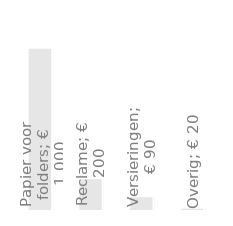
| Category | Jaaruitgaven |
|---|---|
| Papier voor folders | 1000 |
| Reclame | 200 |
| Versieringen | 90 |
| Overig | 20 |